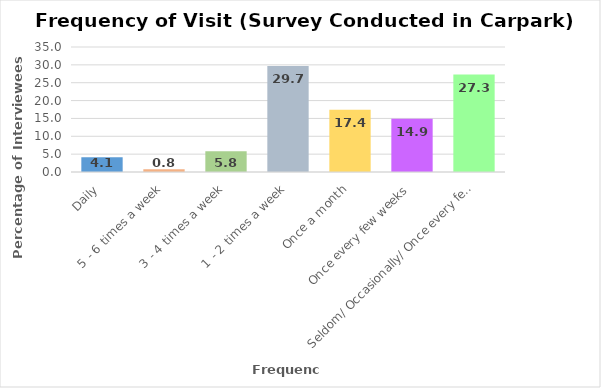
| Category | Series 0 |
|---|---|
| Daily | 4.1 |
| 5 - 6 times a week | 0.8 |
| 3 - 4 times a week | 5.8 |
| 1 - 2 times a week | 29.7 |
| Once a month | 17.4 |
| Once every few weeks | 14.9 |
| Seldom/ Occasionally/ Once every few mths | 27.3 |